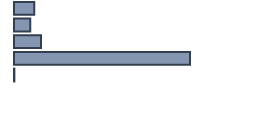
| Category | Percentatge |
|---|---|
| 0 | 8.485 |
| 1 | 6.818 |
| 2 | 11.212 |
| 3 | 73.333 |
| 4 | 0.152 |
| 5 | 0 |